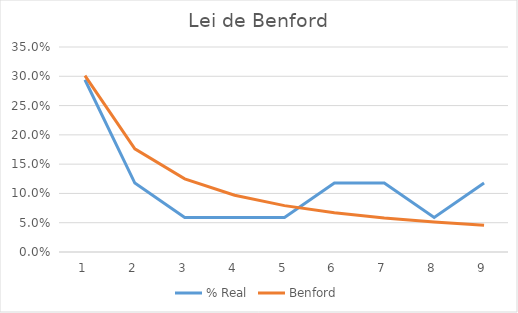
| Category | % Real | Benford |
|---|---|---|
| 0 | 0.294 | 0.301 |
| 1 | 0.118 | 0.176 |
| 2 | 0.059 | 0.125 |
| 3 | 0.059 | 0.097 |
| 4 | 0.059 | 0.079 |
| 5 | 0.118 | 0.067 |
| 6 | 0.118 | 0.058 |
| 7 | 0.059 | 0.051 |
| 8 | 0.118 | 0.046 |